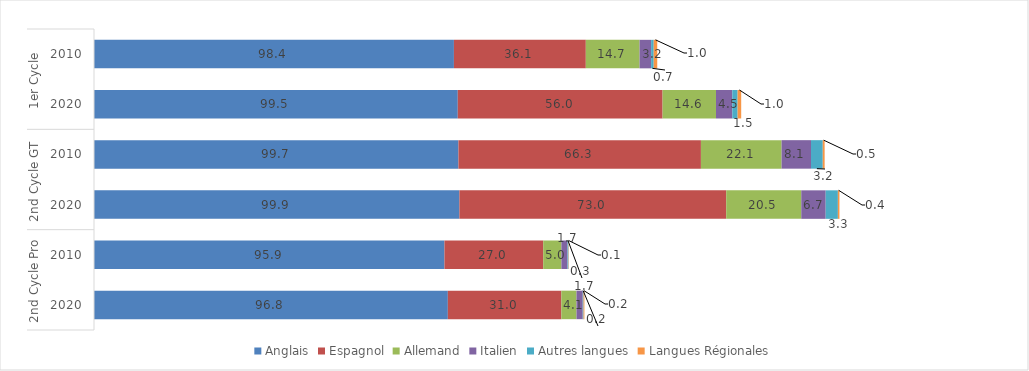
| Category | Anglais | Espagnol | Allemand | Italien | Autres langues | Langues Régionales |
|---|---|---|---|---|---|---|
| 0 | 98.447 | 36.077 | 14.707 | 3.155 | 0.708 | 0.966 |
| 1 | 99.504 | 56.016 | 14.613 | 4.451 | 1.461 | 0.979 |
| 2 | 99.679 | 66.328 | 22.056 | 8.052 | 3.219 | 0.511 |
| 3 | 99.944 | 72.983 | 20.525 | 6.685 | 3.332 | 0.433 |
| 4 | 95.855 | 27.018 | 4.975 | 1.667 | 0.254 | 0.096 |
| 5 | 96.786 | 31.04 | 4.147 | 1.706 | 0.221 | 0.244 |